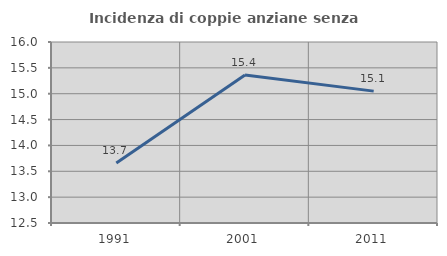
| Category | Incidenza di coppie anziane senza figli  |
|---|---|
| 1991.0 | 13.661 |
| 2001.0 | 15.361 |
| 2011.0 | 15.05 |